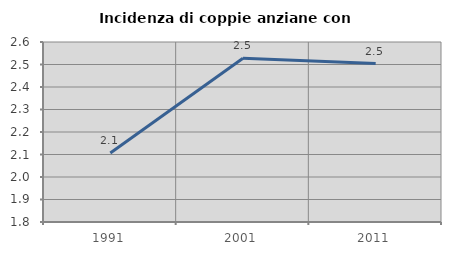
| Category | Incidenza di coppie anziane con figli |
|---|---|
| 1991.0 | 2.107 |
| 2001.0 | 2.528 |
| 2011.0 | 2.504 |